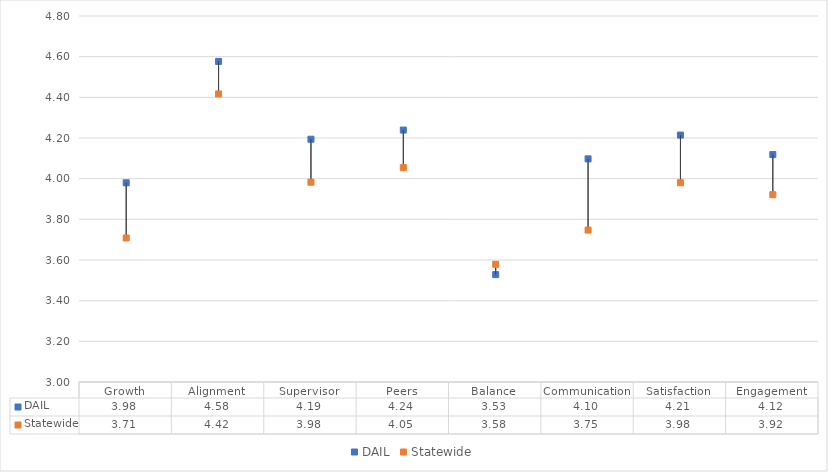
| Category | DAIL | Statewide |
|---|---|---|
| Growth | 3.98 | 3.708 |
| Alignment | 4.577 | 4.417 |
| Supervisor | 4.194 | 3.983 |
| Peers | 4.239 | 4.054 |
| Balance | 3.528 | 3.579 |
| Communication | 4.097 | 3.747 |
| Satisfaction | 4.214 | 3.98 |
| Engagement | 4.118 | 3.921 |